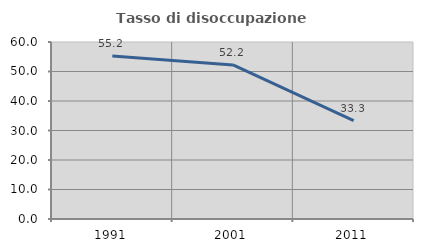
| Category | Tasso di disoccupazione giovanile  |
|---|---|
| 1991.0 | 55.219 |
| 2001.0 | 52.239 |
| 2011.0 | 33.333 |